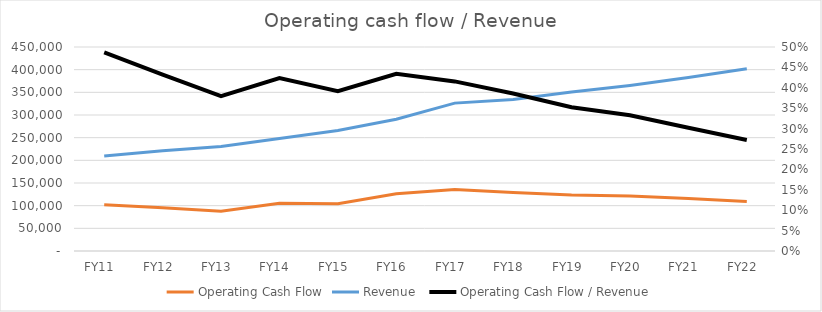
| Category | Operating Cash Flow | Revenue |
|---|---|---|
| FY11  | 102037.864 | 209591.43 |
| FY12  | 95571.548 | 220985.743 |
| FY13  | 87473.295 | 230429.261 |
| FY14  | 105164.993 | 247989.841 |
| FY15  | 104075.578 | 265855.45 |
| FY16  | 126147.448 | 290471.114 |
| FY17  | 135597.462 | 326213.149 |
| FY18  | 129082.801 | 334356.494 |
| FY19  | 123521.752 | 350536.807 |
| FY20  | 121492.581 | 365276.666 |
| FY21  | 115656.487 | 382692.168 |
| FY22  | 109229.098 | 401785.618 |